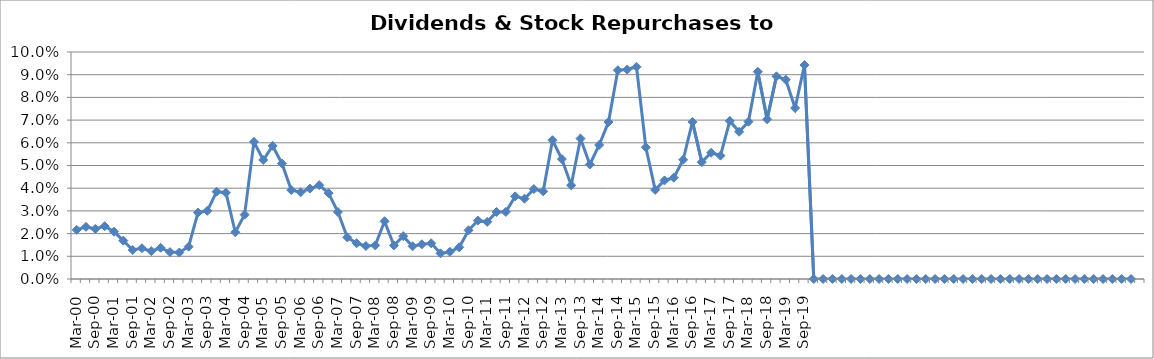
| Category | Dividends & Stock Repurchases to Revenue% |
|---|---|
| Mar-00 | 0.022 |
| Jun-00 | 0.023 |
| Sep-00 | 0.022 |
| Dec-00 | 0.023 |
| Mar-01 | 0.021 |
| Jun-01 | 0.017 |
| Sep-01 | 0.013 |
| Dec-01 | 0.014 |
| Mar-02 | 0.012 |
| Jun-02 | 0.014 |
| Sep-02 | 0.012 |
| Dec-02 | 0.012 |
| Mar-03 | 0.014 |
| Jun-03 | 0.029 |
| Sep-03 | 0.03 |
| Dec-03 | 0.038 |
| Mar-04 | 0.038 |
| Jun-04 | 0.021 |
| Sep-04 | 0.028 |
| Dec-04 | 0.06 |
| Mar-05 | 0.052 |
| Jun-05 | 0.059 |
| Sep-05 | 0.051 |
| Dec-05 | 0.039 |
| Mar-06 | 0.038 |
| Jun-06 | 0.04 |
| Sep-06 | 0.041 |
| Dec-06 | 0.038 |
| Mar-07 | 0.029 |
| Jun-07 | 0.018 |
| Sep-07 | 0.016 |
| Dec-07 | 0.015 |
| Mar-08 | 0.015 |
| Jun-08 | 0.025 |
| Sep-08 | 0.015 |
| Dec-08 | 0.019 |
| Mar-09 | 0.014 |
| Jun-09 | 0.015 |
| Sep-09 | 0.016 |
| Dec-09 | 0.011 |
| Mar-10 | 0.012 |
| Jun-10 | 0.014 |
| Sep-10 | 0.021 |
| Dec-10 | 0.026 |
| Mar-11 | 0.025 |
| Jun-11 | 0.03 |
| Sep-11 | 0.03 |
| Dec-11 | 0.036 |
| Mar-12 | 0.035 |
| Jun-12 | 0.04 |
| Sep-12 | 0.039 |
| Dec-12 | 0.061 |
| Mar-13 | 0.053 |
| Jun-13 | 0.041 |
| Sep-13 | 0.062 |
| Dec-13 | 0.05 |
| Mar-14 | 0.059 |
| Jun-14 | 0.069 |
| Sep-14 | 0.092 |
| Dec-14 | 0.092 |
| Mar-15 | 0.093 |
| Jun-15 | 0.058 |
| Sep-15 | 0.039 |
| Dec-15 | 0.043 |
| Mar-16 | 0.045 |
| Jun-16 | 0.053 |
| Sep-16 | 0.069 |
| Dec-16 | 0.052 |
| Mar-17 | 0.056 |
| Jun-17 | 0.054 |
| Sep-17 | 0.07 |
| Dec-17 | 0.065 |
| Mar-18 | 0.069 |
| Jun-18 | 0.091 |
| Sep-18 | 0.07 |
| Dec-18 | 0.089 |
| Mar-19 | 0.088 |
| Jun-19 | 0.075 |
| Sep-19 | 0.094 |